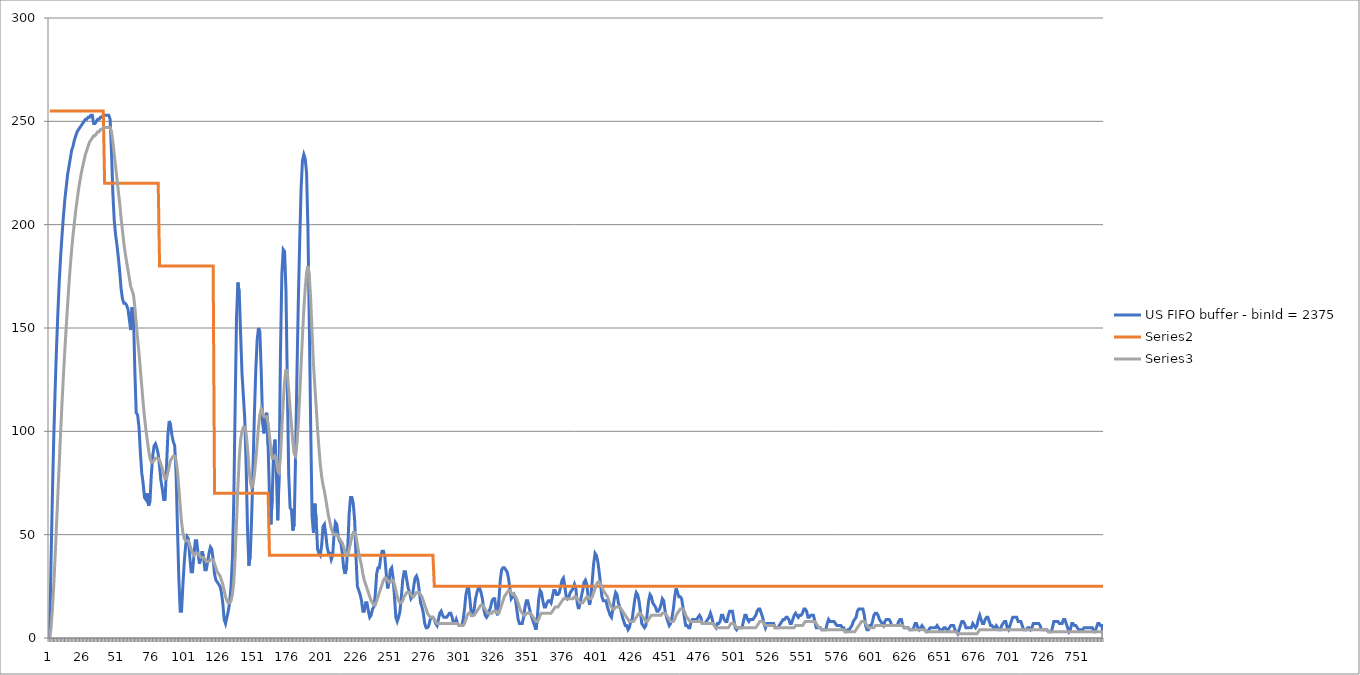
| Category | US FIFO buffer - binId = 2375 | Series 1 | Series 2 |
|---|---|---|---|
| 0 | 0 | 255 | 0 |
| 1 | 38 | 255 | 5 |
| 2 | 70 | 255 | 14 |
| 3 | 98 | 255 | 26 |
| 4 | 121 | 255 | 40 |
| 5 | 141 | 255 | 55 |
| 6 | 158 | 255 | 70 |
| 7 | 173 | 255 | 85 |
| 8 | 185 | 255 | 100 |
| 9 | 195 | 255 | 114 |
| 10 | 204 | 255 | 127 |
| 11 | 212 | 255 | 139 |
| 12 | 218 | 255 | 150 |
| 13 | 224 | 255 | 161 |
| 14 | 228 | 255 | 171 |
| 15 | 232 | 255 | 180 |
| 16 | 236 | 255 | 188 |
| 17 | 238 | 255 | 195 |
| 18 | 241 | 255 | 201 |
| 19 | 243 | 255 | 207 |
| 20 | 245 | 255 | 212 |
| 21 | 246 | 255 | 217 |
| 22 | 247 | 255 | 221 |
| 23 | 248 | 255 | 225 |
| 24 | 249 | 255 | 228 |
| 25 | 250 | 255 | 231 |
| 26 | 251 | 255 | 234 |
| 27 | 251 | 255 | 236 |
| 28 | 252 | 255 | 238 |
| 29 | 252 | 255 | 240 |
| 30 | 253 | 255 | 241 |
| 31 | 253 | 255 | 242 |
| 32 | 249 | 255 | 243 |
| 33 | 249 | 255 | 243 |
| 34 | 250 | 255 | 244 |
| 35 | 251 | 255 | 245 |
| 36 | 251 | 255 | 245 |
| 37 | 252 | 255 | 246 |
| 38 | 252 | 255 | 246 |
| 39 | 253 | 255 | 247 |
| 40 | 253 | 220 | 247 |
| 41 | 253 | 220 | 247 |
| 42 | 253 | 220 | 247 |
| 43 | 253 | 220 | 247 |
| 44 | 251 | 220 | 247 |
| 45 | 235 | 220 | 245 |
| 46 | 215 | 220 | 240 |
| 47 | 202 | 220 | 234 |
| 48 | 195 | 220 | 228 |
| 49 | 190 | 220 | 222 |
| 50 | 184 | 220 | 216 |
| 51 | 177 | 220 | 210 |
| 52 | 169 | 220 | 203 |
| 53 | 164 | 220 | 197 |
| 54 | 162 | 220 | 191 |
| 55 | 162 | 220 | 186 |
| 56 | 161 | 220 | 182 |
| 57 | 159 | 220 | 178 |
| 58 | 154 | 220 | 174 |
| 59 | 149 | 220 | 170 |
| 60 | 160 | 220 | 168 |
| 61 | 156 | 220 | 166 |
| 62 | 129 | 220 | 160 |
| 63 | 109 | 220 | 152 |
| 64 | 108 | 220 | 145 |
| 65 | 102 | 220 | 138 |
| 66 | 90 | 220 | 130 |
| 67 | 80 | 220 | 122 |
| 68 | 75 | 220 | 114 |
| 69 | 68 | 220 | 107 |
| 70 | 67 | 220 | 101 |
| 71 | 70 | 220 | 96 |
| 72 | 64 | 220 | 91 |
| 73 | 66 | 220 | 87 |
| 74 | 79 | 220 | 85 |
| 75 | 88 | 220 | 85 |
| 76 | 93 | 220 | 86 |
| 77 | 94 | 220 | 87 |
| 78 | 92 | 220 | 87 |
| 79 | 89 | 220 | 87 |
| 80 | 83 | 180 | 86 |
| 81 | 76 | 180 | 84 |
| 82 | 72 | 180 | 82 |
| 83 | 67 | 180 | 79 |
| 84 | 67 | 180 | 77 |
| 85 | 82 | 180 | 77 |
| 86 | 98 | 180 | 80 |
| 87 | 105 | 180 | 83 |
| 88 | 103 | 180 | 86 |
| 89 | 98 | 180 | 87 |
| 90 | 95 | 180 | 88 |
| 91 | 93 | 180 | 88 |
| 92 | 80 | 180 | 86 |
| 93 | 54 | 180 | 81 |
| 94 | 29 | 180 | 73 |
| 95 | 13 | 180 | 64 |
| 96 | 13 | 180 | 56 |
| 97 | 26 | 180 | 51 |
| 98 | 37 | 180 | 48 |
| 99 | 45 | 180 | 47 |
| 100 | 49 | 180 | 47 |
| 101 | 48 | 180 | 47 |
| 102 | 39 | 180 | 45 |
| 103 | 32 | 180 | 43 |
| 104 | 32 | 180 | 41 |
| 105 | 40 | 180 | 40 |
| 106 | 47 | 180 | 41 |
| 107 | 47 | 180 | 41 |
| 108 | 41 | 180 | 41 |
| 109 | 36 | 180 | 40 |
| 110 | 39 | 180 | 39 |
| 111 | 42 | 180 | 39 |
| 112 | 39 | 180 | 39 |
| 113 | 33 | 180 | 38 |
| 114 | 33 | 180 | 37 |
| 115 | 37 | 180 | 37 |
| 116 | 41 | 180 | 37 |
| 117 | 44 | 180 | 38 |
| 118 | 43 | 180 | 38 |
| 119 | 38 | 180 | 38 |
| 120 | 31 | 70 | 36 |
| 121 | 28 | 70 | 34 |
| 122 | 27 | 70 | 32 |
| 123 | 26 | 70 | 31 |
| 124 | 25 | 70 | 30 |
| 125 | 22 | 70 | 28 |
| 126 | 17 | 70 | 26 |
| 127 | 9 | 70 | 23 |
| 128 | 7 | 70 | 20 |
| 129 | 10 | 70 | 18 |
| 130 | 13 | 70 | 17 |
| 131 | 17 | 70 | 17 |
| 132 | 25 | 70 | 18 |
| 133 | 38 | 70 | 21 |
| 134 | 66 | 70 | 27 |
| 135 | 112 | 70 | 39 |
| 136 | 155 | 70 | 56 |
| 137 | 172 | 70 | 73 |
| 138 | 167 | 70 | 87 |
| 139 | 147 | 70 | 96 |
| 140 | 128 | 70 | 100 |
| 141 | 117 | 70 | 102 |
| 142 | 106 | 70 | 102 |
| 143 | 84 | 70 | 99 |
| 144 | 53 | 70 | 92 |
| 145 | 35 | 70 | 83 |
| 146 | 40 | 70 | 76 |
| 147 | 58 | 70 | 73 |
| 148 | 82 | 70 | 74 |
| 149 | 108 | 70 | 79 |
| 150 | 129 | 70 | 86 |
| 151 | 144 | 70 | 94 |
| 152 | 150 | 70 | 102 |
| 153 | 148 | 70 | 108 |
| 154 | 129 | 70 | 111 |
| 155 | 104 | 70 | 109 |
| 156 | 99 | 70 | 107 |
| 157 | 107 | 70 | 107 |
| 158 | 109 | 70 | 107 |
| 159 | 93 | 70 | 104 |
| 160 | 69 | 40 | 98 |
| 161 | 55 | 40 | 91 |
| 162 | 68 | 40 | 87 |
| 163 | 91 | 40 | 87 |
| 164 | 96 | 40 | 88 |
| 165 | 80 | 40 | 86 |
| 166 | 57 | 40 | 81 |
| 167 | 79 | 40 | 80 |
| 168 | 138 | 40 | 88 |
| 169 | 176 | 40 | 101 |
| 170 | 188 | 40 | 114 |
| 171 | 187 | 40 | 124 |
| 172 | 168 | 40 | 130 |
| 173 | 123 | 40 | 128 |
| 174 | 79 | 40 | 120 |
| 175 | 63 | 40 | 111 |
| 176 | 62 | 40 | 103 |
| 177 | 52 | 40 | 95 |
| 178 | 55 | 40 | 89 |
| 179 | 88 | 40 | 88 |
| 180 | 128 | 40 | 94 |
| 181 | 163 | 40 | 104 |
| 182 | 192 | 40 | 117 |
| 183 | 217 | 40 | 132 |
| 184 | 231 | 40 | 146 |
| 185 | 234 | 40 | 159 |
| 186 | 232 | 40 | 169 |
| 187 | 225 | 40 | 177 |
| 188 | 198 | 40 | 180 |
| 189 | 152 | 40 | 175 |
| 190 | 102 | 40 | 164 |
| 191 | 59 | 40 | 148 |
| 192 | 51 | 40 | 133 |
| 193 | 65 | 40 | 122 |
| 194 | 57 | 40 | 112 |
| 195 | 43 | 40 | 101 |
| 196 | 41 | 40 | 92 |
| 197 | 40 | 40 | 84 |
| 198 | 45 | 40 | 78 |
| 199 | 54 | 40 | 74 |
| 200 | 55 | 40 | 71 |
| 201 | 50 | 40 | 67 |
| 202 | 44 | 40 | 63 |
| 203 | 41 | 40 | 59 |
| 204 | 41 | 40 | 56 |
| 205 | 38 | 40 | 53 |
| 206 | 40 | 40 | 51 |
| 207 | 50 | 40 | 50 |
| 208 | 56 | 40 | 50 |
| 209 | 55 | 40 | 50 |
| 210 | 49 | 40 | 49 |
| 211 | 47 | 40 | 48 |
| 212 | 46 | 40 | 47 |
| 213 | 41 | 40 | 46 |
| 214 | 34 | 40 | 44 |
| 215 | 31 | 40 | 42 |
| 216 | 34 | 40 | 40 |
| 217 | 44 | 40 | 40 |
| 218 | 60 | 40 | 43 |
| 219 | 68 | 40 | 46 |
| 220 | 68 | 40 | 49 |
| 221 | 65 | 40 | 51 |
| 222 | 57 | 40 | 51 |
| 223 | 39 | 40 | 49 |
| 224 | 25 | 40 | 45 |
| 225 | 23 | 40 | 41 |
| 226 | 21 | 40 | 38 |
| 227 | 18 | 40 | 35 |
| 228 | 13 | 40 | 31 |
| 229 | 13 | 40 | 28 |
| 230 | 17 | 40 | 26 |
| 231 | 17 | 40 | 24 |
| 232 | 13 | 40 | 22 |
| 233 | 10 | 40 | 20 |
| 234 | 11 | 40 | 18 |
| 235 | 14 | 40 | 17 |
| 236 | 15 | 40 | 16 |
| 237 | 21 | 40 | 16 |
| 238 | 31 | 40 | 18 |
| 239 | 34 | 40 | 20 |
| 240 | 34 | 40 | 22 |
| 241 | 39 | 40 | 24 |
| 242 | 42 | 40 | 26 |
| 243 | 42 | 40 | 28 |
| 244 | 39 | 40 | 29 |
| 245 | 31 | 40 | 29 |
| 246 | 24 | 40 | 28 |
| 247 | 27 | 40 | 27 |
| 248 | 33 | 40 | 27 |
| 249 | 34 | 40 | 28 |
| 250 | 29 | 40 | 28 |
| 251 | 20 | 40 | 26 |
| 252 | 10 | 40 | 23 |
| 253 | 8 | 40 | 20 |
| 254 | 10 | 40 | 18 |
| 255 | 13 | 40 | 17 |
| 256 | 20 | 40 | 17 |
| 257 | 28 | 40 | 18 |
| 258 | 32 | 40 | 20 |
| 259 | 32 | 40 | 21 |
| 260 | 28 | 40 | 22 |
| 261 | 24 | 40 | 22 |
| 262 | 22 | 40 | 22 |
| 263 | 19 | 40 | 21 |
| 264 | 20 | 40 | 20 |
| 265 | 25 | 40 | 20 |
| 266 | 29 | 40 | 21 |
| 267 | 30 | 40 | 22 |
| 268 | 28 | 40 | 22 |
| 269 | 23 | 40 | 22 |
| 270 | 17 | 40 | 21 |
| 271 | 15 | 40 | 20 |
| 272 | 12 | 40 | 18 |
| 273 | 7 | 40 | 16 |
| 274 | 5 | 40 | 14 |
| 275 | 5 | 40 | 12 |
| 276 | 6 | 40 | 11 |
| 277 | 9 | 40 | 10 |
| 278 | 10 | 40 | 10 |
| 279 | 10 | 40 | 10 |
| 280 | 9 | 25 | 9 |
| 281 | 7 | 25 | 8 |
| 282 | 6 | 25 | 7 |
| 283 | 9 | 25 | 7 |
| 284 | 12 | 25 | 7 |
| 285 | 13 | 25 | 7 |
| 286 | 11 | 25 | 7 |
| 287 | 10 | 25 | 7 |
| 288 | 10 | 25 | 7 |
| 289 | 10 | 25 | 7 |
| 290 | 11 | 25 | 7 |
| 291 | 12 | 25 | 7 |
| 292 | 12 | 25 | 7 |
| 293 | 10 | 25 | 7 |
| 294 | 7 | 25 | 7 |
| 295 | 7 | 25 | 7 |
| 296 | 9 | 25 | 7 |
| 297 | 7 | 25 | 7 |
| 298 | 6 | 25 | 6 |
| 299 | 6 | 25 | 6 |
| 300 | 6 | 25 | 6 |
| 301 | 9 | 25 | 6 |
| 302 | 14 | 25 | 7 |
| 303 | 21 | 25 | 9 |
| 304 | 24 | 25 | 11 |
| 305 | 24 | 25 | 12 |
| 306 | 18 | 25 | 12 |
| 307 | 11 | 25 | 11 |
| 308 | 11 | 25 | 11 |
| 309 | 14 | 25 | 11 |
| 310 | 19 | 25 | 12 |
| 311 | 22 | 25 | 13 |
| 312 | 24 | 25 | 14 |
| 313 | 24 | 25 | 15 |
| 314 | 22 | 25 | 16 |
| 315 | 19 | 25 | 16 |
| 316 | 14 | 25 | 15 |
| 317 | 11 | 25 | 14 |
| 318 | 10 | 25 | 13 |
| 319 | 11 | 25 | 12 |
| 320 | 13 | 25 | 12 |
| 321 | 15 | 25 | 12 |
| 322 | 18 | 25 | 12 |
| 323 | 19 | 25 | 13 |
| 324 | 19 | 25 | 13 |
| 325 | 13 | 25 | 13 |
| 326 | 11 | 25 | 12 |
| 327 | 18 | 25 | 12 |
| 328 | 28 | 25 | 14 |
| 329 | 33 | 25 | 16 |
| 330 | 34 | 25 | 18 |
| 331 | 34 | 25 | 20 |
| 332 | 33 | 25 | 21 |
| 333 | 32 | 25 | 22 |
| 334 | 29 | 25 | 23 |
| 335 | 24 | 25 | 23 |
| 336 | 19 | 25 | 22 |
| 337 | 20 | 25 | 21 |
| 338 | 21 | 25 | 21 |
| 339 | 19 | 25 | 20 |
| 340 | 14 | 25 | 19 |
| 341 | 9 | 25 | 17 |
| 342 | 7 | 25 | 15 |
| 343 | 7 | 25 | 13 |
| 344 | 7 | 25 | 12 |
| 345 | 10 | 25 | 11 |
| 346 | 15 | 25 | 11 |
| 347 | 18 | 25 | 12 |
| 348 | 18 | 25 | 12 |
| 349 | 15 | 25 | 12 |
| 350 | 12 | 25 | 12 |
| 351 | 10 | 25 | 11 |
| 352 | 8 | 25 | 10 |
| 353 | 6 | 25 | 9 |
| 354 | 4 | 25 | 8 |
| 355 | 10 | 25 | 8 |
| 356 | 19 | 25 | 9 |
| 357 | 23 | 25 | 11 |
| 358 | 22 | 25 | 12 |
| 359 | 18 | 25 | 12 |
| 360 | 15 | 25 | 12 |
| 361 | 15 | 25 | 12 |
| 362 | 17 | 25 | 12 |
| 363 | 18 | 25 | 12 |
| 364 | 18 | 25 | 12 |
| 365 | 17 | 25 | 12 |
| 366 | 20 | 25 | 13 |
| 367 | 23 | 25 | 14 |
| 368 | 23 | 25 | 15 |
| 369 | 21 | 25 | 15 |
| 370 | 21 | 25 | 15 |
| 371 | 22 | 25 | 16 |
| 372 | 25 | 25 | 17 |
| 373 | 28 | 25 | 18 |
| 374 | 29 | 25 | 19 |
| 375 | 25 | 25 | 19 |
| 376 | 20 | 25 | 19 |
| 377 | 19 | 25 | 19 |
| 378 | 20 | 25 | 19 |
| 379 | 22 | 25 | 19 |
| 380 | 23 | 25 | 19 |
| 381 | 24 | 25 | 19 |
| 382 | 26 | 25 | 20 |
| 383 | 24 | 25 | 20 |
| 384 | 17 | 25 | 19 |
| 385 | 14 | 25 | 18 |
| 386 | 17 | 25 | 17 |
| 387 | 20 | 25 | 17 |
| 388 | 23 | 25 | 17 |
| 389 | 27 | 25 | 18 |
| 390 | 28 | 25 | 19 |
| 391 | 26 | 25 | 20 |
| 392 | 20 | 25 | 20 |
| 393 | 16 | 25 | 19 |
| 394 | 20 | 25 | 19 |
| 395 | 28 | 25 | 20 |
| 396 | 36 | 25 | 22 |
| 397 | 41 | 25 | 24 |
| 398 | 40 | 25 | 26 |
| 399 | 37 | 25 | 27 |
| 400 | 32 | 25 | 27 |
| 401 | 26 | 25 | 26 |
| 402 | 20 | 25 | 25 |
| 403 | 18 | 25 | 23 |
| 404 | 18 | 25 | 22 |
| 405 | 18 | 25 | 21 |
| 406 | 15 | 25 | 20 |
| 407 | 13 | 25 | 18 |
| 408 | 11 | 25 | 16 |
| 409 | 10 | 25 | 15 |
| 410 | 14 | 25 | 14 |
| 411 | 19 | 25 | 14 |
| 412 | 22 | 25 | 15 |
| 413 | 21 | 25 | 15 |
| 414 | 17 | 25 | 15 |
| 415 | 15 | 25 | 15 |
| 416 | 13 | 25 | 14 |
| 417 | 10 | 25 | 13 |
| 418 | 8 | 25 | 12 |
| 419 | 6 | 25 | 11 |
| 420 | 6 | 25 | 10 |
| 421 | 4 | 25 | 9 |
| 422 | 5 | 25 | 8 |
| 423 | 8 | 25 | 8 |
| 424 | 9 | 25 | 8 |
| 425 | 14 | 25 | 8 |
| 426 | 19 | 25 | 9 |
| 427 | 22 | 25 | 10 |
| 428 | 21 | 25 | 11 |
| 429 | 18 | 25 | 12 |
| 430 | 13 | 25 | 12 |
| 431 | 7 | 25 | 11 |
| 432 | 6 | 25 | 10 |
| 433 | 5 | 25 | 9 |
| 434 | 6 | 25 | 8 |
| 435 | 12 | 25 | 8 |
| 436 | 18 | 25 | 9 |
| 437 | 21 | 25 | 10 |
| 438 | 20 | 25 | 11 |
| 439 | 17 | 25 | 11 |
| 440 | 16 | 25 | 11 |
| 441 | 15 | 25 | 11 |
| 442 | 13 | 25 | 11 |
| 443 | 13 | 25 | 11 |
| 444 | 14 | 25 | 11 |
| 445 | 16 | 25 | 11 |
| 446 | 19 | 25 | 12 |
| 447 | 18 | 25 | 12 |
| 448 | 13 | 25 | 12 |
| 449 | 10 | 25 | 11 |
| 450 | 8 | 25 | 10 |
| 451 | 6 | 25 | 9 |
| 452 | 7 | 25 | 8 |
| 453 | 10 | 25 | 8 |
| 454 | 14 | 25 | 8 |
| 455 | 20 | 25 | 9 |
| 456 | 24 | 25 | 11 |
| 457 | 22 | 25 | 12 |
| 458 | 20 | 25 | 13 |
| 459 | 20 | 25 | 14 |
| 460 | 19 | 25 | 14 |
| 461 | 15 | 25 | 14 |
| 462 | 10 | 25 | 13 |
| 463 | 6 | 25 | 11 |
| 464 | 6 | 25 | 10 |
| 465 | 5 | 25 | 9 |
| 466 | 5 | 25 | 8 |
| 467 | 8 | 25 | 8 |
| 468 | 9 | 25 | 8 |
| 469 | 9 | 25 | 8 |
| 470 | 9 | 25 | 8 |
| 471 | 9 | 25 | 8 |
| 472 | 10 | 25 | 8 |
| 473 | 11 | 25 | 8 |
| 474 | 10 | 25 | 8 |
| 475 | 7 | 25 | 7 |
| 476 | 7 | 25 | 7 |
| 477 | 7 | 25 | 7 |
| 478 | 8 | 25 | 7 |
| 479 | 9 | 25 | 7 |
| 480 | 10 | 25 | 7 |
| 481 | 12 | 25 | 7 |
| 482 | 10 | 25 | 7 |
| 483 | 7 | 25 | 7 |
| 484 | 6 | 25 | 6 |
| 485 | 5 | 25 | 5 |
| 486 | 7 | 25 | 5 |
| 487 | 7 | 25 | 5 |
| 488 | 8 | 25 | 5 |
| 489 | 11 | 25 | 5 |
| 490 | 11 | 25 | 5 |
| 491 | 9 | 25 | 5 |
| 492 | 8 | 25 | 5 |
| 493 | 8 | 25 | 5 |
| 494 | 11 | 25 | 5 |
| 495 | 13 | 25 | 6 |
| 496 | 13 | 25 | 7 |
| 497 | 13 | 25 | 7 |
| 498 | 9 | 25 | 7 |
| 499 | 5 | 25 | 6 |
| 500 | 4 | 25 | 5 |
| 501 | 5 | 25 | 5 |
| 502 | 5 | 25 | 5 |
| 503 | 5 | 25 | 5 |
| 504 | 5 | 25 | 5 |
| 505 | 8 | 25 | 5 |
| 506 | 11 | 25 | 5 |
| 507 | 11 | 25 | 5 |
| 508 | 9 | 25 | 5 |
| 509 | 8 | 25 | 5 |
| 510 | 9 | 25 | 5 |
| 511 | 9 | 25 | 5 |
| 512 | 9 | 25 | 5 |
| 513 | 10 | 25 | 5 |
| 514 | 11 | 25 | 5 |
| 515 | 13 | 25 | 6 |
| 516 | 14 | 25 | 7 |
| 517 | 14 | 25 | 8 |
| 518 | 12 | 25 | 8 |
| 519 | 10 | 25 | 8 |
| 520 | 7 | 25 | 7 |
| 521 | 5 | 25 | 6 |
| 522 | 7 | 25 | 6 |
| 523 | 7 | 25 | 6 |
| 524 | 7 | 25 | 6 |
| 525 | 7 | 25 | 6 |
| 526 | 7 | 25 | 6 |
| 527 | 7 | 25 | 6 |
| 528 | 5 | 25 | 5 |
| 529 | 5 | 25 | 5 |
| 530 | 5 | 25 | 5 |
| 531 | 6 | 25 | 5 |
| 532 | 7 | 25 | 5 |
| 533 | 8 | 25 | 5 |
| 534 | 9 | 25 | 5 |
| 535 | 9 | 25 | 5 |
| 536 | 10 | 25 | 5 |
| 537 | 10 | 25 | 5 |
| 538 | 9 | 25 | 5 |
| 539 | 7 | 25 | 5 |
| 540 | 7 | 25 | 5 |
| 541 | 9 | 25 | 5 |
| 542 | 11 | 25 | 5 |
| 543 | 12 | 25 | 6 |
| 544 | 11 | 25 | 6 |
| 545 | 10 | 25 | 6 |
| 546 | 11 | 25 | 6 |
| 547 | 11 | 25 | 6 |
| 548 | 12 | 25 | 6 |
| 549 | 14 | 25 | 7 |
| 550 | 14 | 25 | 8 |
| 551 | 13 | 25 | 8 |
| 552 | 10 | 25 | 8 |
| 553 | 10 | 25 | 8 |
| 554 | 11 | 25 | 8 |
| 555 | 11 | 25 | 8 |
| 556 | 11 | 25 | 8 |
| 557 | 8 | 25 | 8 |
| 558 | 5 | 25 | 7 |
| 559 | 5 | 25 | 6 |
| 560 | 5 | 25 | 5 |
| 561 | 5 | 25 | 5 |
| 562 | 4 | 25 | 4 |
| 563 | 4 | 25 | 4 |
| 564 | 4 | 25 | 4 |
| 565 | 4 | 25 | 4 |
| 566 | 7 | 25 | 4 |
| 567 | 9 | 25 | 4 |
| 568 | 8 | 25 | 4 |
| 569 | 8 | 25 | 4 |
| 570 | 8 | 25 | 4 |
| 571 | 8 | 25 | 4 |
| 572 | 7 | 25 | 4 |
| 573 | 6 | 25 | 4 |
| 574 | 6 | 25 | 4 |
| 575 | 6 | 25 | 4 |
| 576 | 6 | 25 | 4 |
| 577 | 5 | 25 | 4 |
| 578 | 5 | 25 | 4 |
| 579 | 3 | 25 | 3 |
| 580 | 3 | 25 | 3 |
| 581 | 4 | 25 | 3 |
| 582 | 4 | 25 | 3 |
| 583 | 5 | 25 | 3 |
| 584 | 6 | 25 | 3 |
| 585 | 8 | 25 | 3 |
| 586 | 9 | 25 | 3 |
| 587 | 10 | 25 | 4 |
| 588 | 13 | 25 | 5 |
| 589 | 14 | 25 | 6 |
| 590 | 14 | 25 | 7 |
| 591 | 14 | 25 | 8 |
| 592 | 14 | 25 | 8 |
| 593 | 11 | 25 | 8 |
| 594 | 6 | 25 | 7 |
| 595 | 4 | 25 | 6 |
| 596 | 4 | 25 | 5 |
| 597 | 6 | 25 | 5 |
| 598 | 6 | 25 | 5 |
| 599 | 8 | 25 | 5 |
| 600 | 11 | 25 | 5 |
| 601 | 12 | 25 | 6 |
| 602 | 12 | 25 | 6 |
| 603 | 11 | 25 | 6 |
| 604 | 9 | 25 | 6 |
| 605 | 8 | 25 | 6 |
| 606 | 7 | 25 | 6 |
| 607 | 6 | 25 | 6 |
| 608 | 8 | 25 | 6 |
| 609 | 9 | 25 | 6 |
| 610 | 9 | 25 | 6 |
| 611 | 9 | 25 | 6 |
| 612 | 8 | 25 | 6 |
| 613 | 6 | 25 | 6 |
| 614 | 6 | 25 | 6 |
| 615 | 6 | 25 | 6 |
| 616 | 6 | 25 | 6 |
| 617 | 6 | 25 | 6 |
| 618 | 8 | 25 | 6 |
| 619 | 9 | 25 | 6 |
| 620 | 9 | 25 | 6 |
| 621 | 6 | 25 | 6 |
| 622 | 5 | 25 | 5 |
| 623 | 5 | 25 | 5 |
| 624 | 5 | 25 | 5 |
| 625 | 5 | 25 | 5 |
| 626 | 4 | 25 | 4 |
| 627 | 4 | 25 | 4 |
| 628 | 4 | 25 | 4 |
| 629 | 5 | 25 | 4 |
| 630 | 7 | 25 | 4 |
| 631 | 7 | 25 | 4 |
| 632 | 5 | 25 | 4 |
| 633 | 4 | 25 | 4 |
| 634 | 5 | 25 | 4 |
| 635 | 6 | 25 | 4 |
| 636 | 5 | 25 | 4 |
| 637 | 4 | 25 | 4 |
| 638 | 3 | 25 | 3 |
| 639 | 3 | 25 | 3 |
| 640 | 4 | 25 | 3 |
| 641 | 5 | 25 | 3 |
| 642 | 5 | 25 | 3 |
| 643 | 5 | 25 | 3 |
| 644 | 5 | 25 | 3 |
| 645 | 5 | 25 | 3 |
| 646 | 6 | 25 | 3 |
| 647 | 5 | 25 | 3 |
| 648 | 4 | 25 | 3 |
| 649 | 4 | 25 | 3 |
| 650 | 4 | 25 | 3 |
| 651 | 5 | 25 | 3 |
| 652 | 5 | 25 | 3 |
| 653 | 4 | 25 | 3 |
| 654 | 4 | 25 | 3 |
| 655 | 5 | 25 | 3 |
| 656 | 6 | 25 | 3 |
| 657 | 6 | 25 | 3 |
| 658 | 6 | 25 | 3 |
| 659 | 4 | 25 | 3 |
| 660 | 3 | 25 | 3 |
| 661 | 2 | 25 | 2 |
| 662 | 4 | 25 | 2 |
| 663 | 6 | 25 | 2 |
| 664 | 8 | 25 | 2 |
| 665 | 8 | 25 | 2 |
| 666 | 7 | 25 | 2 |
| 667 | 5 | 25 | 2 |
| 668 | 5 | 25 | 2 |
| 669 | 5 | 25 | 2 |
| 670 | 5 | 25 | 2 |
| 671 | 5 | 25 | 2 |
| 672 | 7 | 25 | 2 |
| 673 | 6 | 25 | 2 |
| 674 | 5 | 25 | 2 |
| 675 | 6 | 25 | 2 |
| 676 | 9 | 25 | 3 |
| 677 | 11 | 25 | 4 |
| 678 | 9 | 25 | 4 |
| 679 | 7 | 25 | 4 |
| 680 | 7 | 25 | 4 |
| 681 | 9 | 25 | 4 |
| 682 | 10 | 25 | 4 |
| 683 | 10 | 25 | 4 |
| 684 | 8 | 25 | 4 |
| 685 | 6 | 25 | 4 |
| 686 | 6 | 25 | 4 |
| 687 | 5 | 25 | 4 |
| 688 | 5 | 25 | 4 |
| 689 | 6 | 25 | 4 |
| 690 | 5 | 25 | 4 |
| 691 | 4 | 25 | 4 |
| 692 | 4 | 25 | 4 |
| 693 | 6 | 25 | 4 |
| 694 | 7 | 25 | 4 |
| 695 | 8 | 25 | 4 |
| 696 | 8 | 25 | 4 |
| 697 | 5 | 25 | 4 |
| 698 | 4 | 25 | 4 |
| 699 | 6 | 25 | 4 |
| 700 | 8 | 25 | 4 |
| 701 | 10 | 25 | 4 |
| 702 | 10 | 25 | 4 |
| 703 | 10 | 25 | 4 |
| 704 | 10 | 25 | 4 |
| 705 | 8 | 25 | 4 |
| 706 | 8 | 25 | 4 |
| 707 | 8 | 25 | 4 |
| 708 | 6 | 25 | 4 |
| 709 | 4 | 25 | 4 |
| 710 | 4 | 25 | 4 |
| 711 | 4 | 25 | 4 |
| 712 | 5 | 25 | 4 |
| 713 | 5 | 25 | 4 |
| 714 | 4 | 25 | 4 |
| 715 | 5 | 25 | 4 |
| 716 | 7 | 25 | 4 |
| 717 | 7 | 25 | 4 |
| 718 | 7 | 25 | 4 |
| 719 | 7 | 25 | 4 |
| 720 | 7 | 25 | 4 |
| 721 | 6 | 25 | 4 |
| 722 | 4 | 25 | 4 |
| 723 | 4 | 25 | 4 |
| 724 | 4 | 25 | 4 |
| 725 | 4 | 25 | 4 |
| 726 | 4 | 25 | 4 |
| 727 | 3 | 25 | 3 |
| 728 | 3 | 25 | 3 |
| 729 | 3 | 25 | 3 |
| 730 | 5 | 25 | 3 |
| 731 | 8 | 25 | 3 |
| 732 | 8 | 25 | 3 |
| 733 | 8 | 25 | 3 |
| 734 | 8 | 25 | 3 |
| 735 | 7 | 25 | 3 |
| 736 | 7 | 25 | 3 |
| 737 | 7 | 25 | 3 |
| 738 | 9 | 25 | 3 |
| 739 | 9 | 25 | 3 |
| 740 | 7 | 25 | 3 |
| 741 | 5 | 25 | 3 |
| 742 | 3 | 25 | 3 |
| 743 | 4 | 25 | 3 |
| 744 | 7 | 25 | 3 |
| 745 | 7 | 25 | 3 |
| 746 | 6 | 25 | 3 |
| 747 | 6 | 25 | 3 |
| 748 | 5 | 25 | 3 |
| 749 | 4 | 25 | 3 |
| 750 | 4 | 25 | 3 |
| 751 | 4 | 25 | 3 |
| 752 | 4 | 25 | 3 |
| 753 | 5 | 25 | 3 |
| 754 | 5 | 25 | 3 |
| 755 | 5 | 25 | 3 |
| 756 | 5 | 25 | 3 |
| 757 | 5 | 25 | 3 |
| 758 | 5 | 25 | 3 |
| 759 | 5 | 25 | 3 |
| 760 | 3 | 25 | 3 |
| 761 | 3 | 25 | 3 |
| 762 | 5 | 25 | 3 |
| 763 | 7 | 25 | 3 |
| 764 | 7 | 25 | 3 |
| 765 | 6 | 25 | 3 |
| 766 | 6 | 25 | 3 |
| 767 | 0 | 25 | 0 |